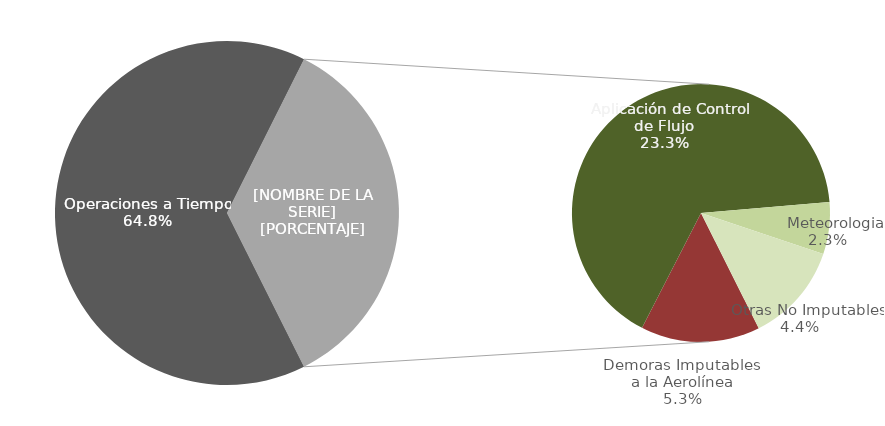
| Category | Demoras |
|---|---|
| Operaciones a Tiempo | 960 |
| Demoras Imputables 
a la Aerolínea | 78 |
|    Aplicación de Control 
de Flujo | 345 |
|    Repercusiones por un 
Tercero | 0 |
|    Meteorologia | 34 |
|    Otras No Imputables | 65 |